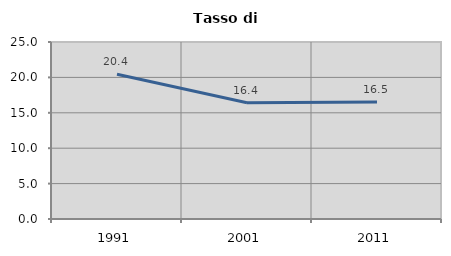
| Category | Tasso di disoccupazione   |
|---|---|
| 1991.0 | 20.449 |
| 2001.0 | 16.428 |
| 2011.0 | 16.511 |